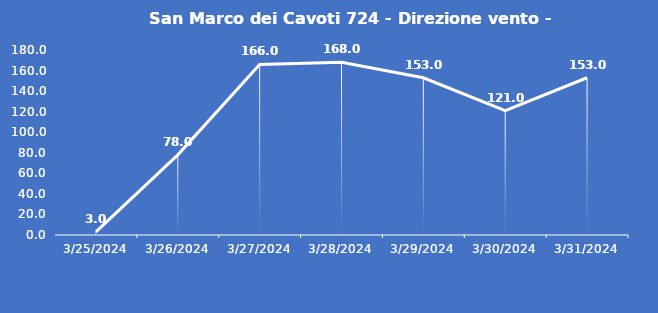
| Category | San Marco dei Cavoti 724 - Direzione vento - Grezzo (°N) |
|---|---|
| 3/25/24 | 3 |
| 3/26/24 | 78 |
| 3/27/24 | 166 |
| 3/28/24 | 168 |
| 3/29/24 | 153 |
| 3/30/24 | 121 |
| 3/31/24 | 153 |